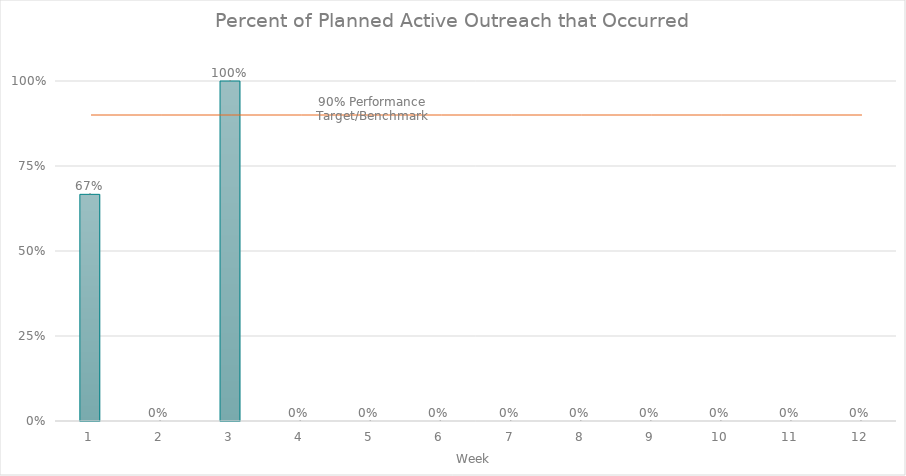
| Category | Series 0 |
|---|---|
| 0 | 0.667 |
| 1 | 0 |
| 2 | 1 |
| 3 | 0 |
| 4 | 0 |
| 5 | 0 |
| 6 | 0 |
| 7 | 0 |
| 8 | 0 |
| 9 | 0 |
| 10 | 0 |
| 11 | 0 |